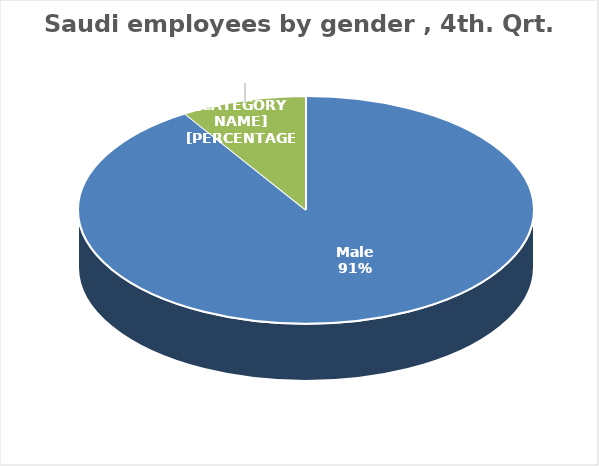
| Category | Series 0 |
|---|---|
| Male | 1577974 |
| Female | 154584 |